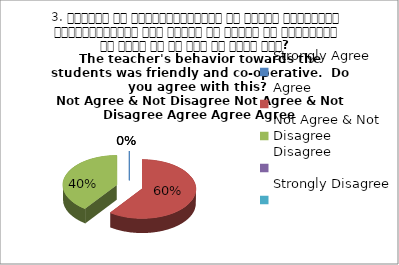
| Category | 3. शिक्षक का विद्यार्थियों के प्रति व्यव्हार मित्रतापूर्ण एवं सहयोग के भावना से परिपूर्ण था क्या आप इस बात से सहमत हैं? 
The teacher's behavior towards the students was friendly and co-operative.  Do you agree with this? 
 Not Agree & Not Disagree Not Agr |
|---|---|
| Strongly Agree | 0 |
| Agree | 3 |
| Not Agree & Not Disagree | 2 |
| Disagree | 0 |
| Strongly Disagree | 0 |